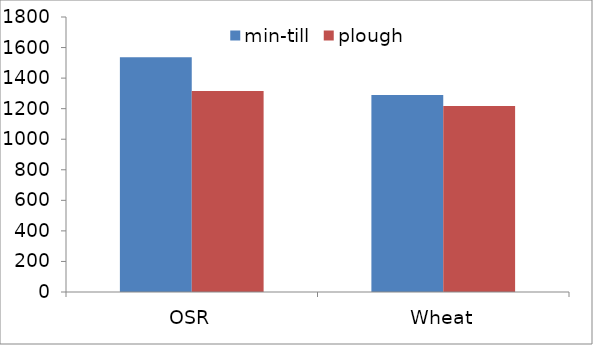
| Category | min-till | plough |
|---|---|---|
| OSR | 1536 | 1316 |
| Wheat | 1289 | 1218 |